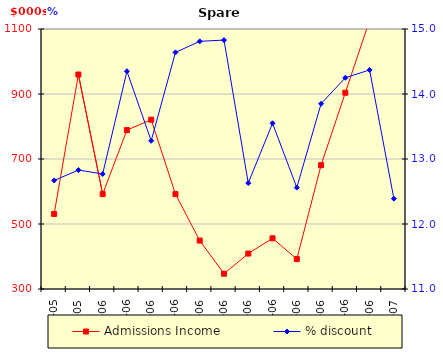
| Category | Admissions Income |
|---|---|
| 2005-11-01 | 531 |
| 2005-12-01 | 960 |
| 2006-01-01 | 592 |
| 2006-02-01 | 789 |
| 2006-03-01 | 821 |
| 2006-04-01 | 592 |
| 2006-05-01 | 449 |
| 2006-06-01 | 347 |
| 2006-07-01 | 409 |
| 2006-08-01 | 456 |
| 2006-09-01 | 392 |
| 2006-10-01 | 681 |
| 2006-11-01 | 904 |
| 2006-12-01 | 1127 |
| 2007-01-01 | 1350 |